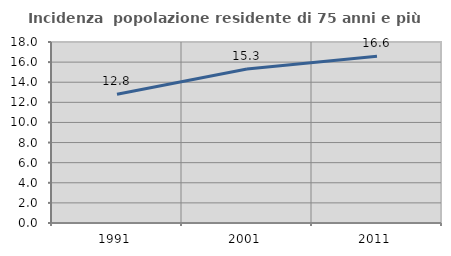
| Category | Incidenza  popolazione residente di 75 anni e più |
|---|---|
| 1991.0 | 12.805 |
| 2001.0 | 15.316 |
| 2011.0 | 16.583 |